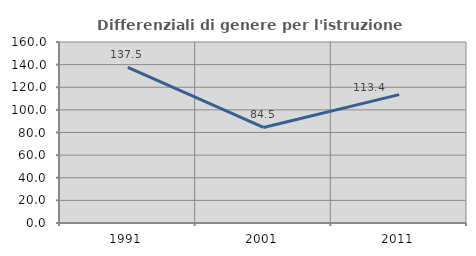
| Category | Differenziali di genere per l'istruzione superiore |
|---|---|
| 1991.0 | 137.468 |
| 2001.0 | 84.459 |
| 2011.0 | 113.445 |